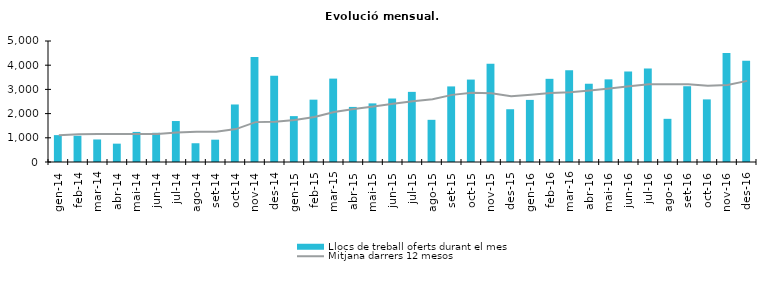
| Category | Llocs de treball oferts durant el mes |
|---|---|
| gen-14 | 1111 |
| feb-14 | 1085 |
| mar-14 | 931 |
| abr-14 | 758 |
| mai-14 | 1243 |
| jun-14 | 1207 |
| jul-14 | 1693 |
| ago-14 | 775 |
| set-14 | 922 |
| oct-14 | 2377 |
| nov-14 | 4341 |
| des-14 | 3561 |
| gen-15 | 1896 |
| feb-15 | 2576 |
| mar-15 | 3446 |
| abr-15 | 2276 |
| mai-15 | 2422 |
| jun-15 | 2624 |
| jul-15 | 2898 |
| ago-15 | 1743 |
| set-15 | 3123 |
| oct-15 | 3406 |
| nov-15 | 4062 |
| des-15 | 2180 |
| gen-16 | 2566 |
| feb-16 | 3437 |
| mar-16 | 3791 |
| abr-16 | 3234 |
| mai-16 | 3415 |
| jun-16 | 3737 |
| jul-16 | 3865 |
| ago-16 | 1784 |
| set-16 | 3131 |
| oct-16 | 2587 |
| nov-16 | 4508 |
| des-16 | 4182 |